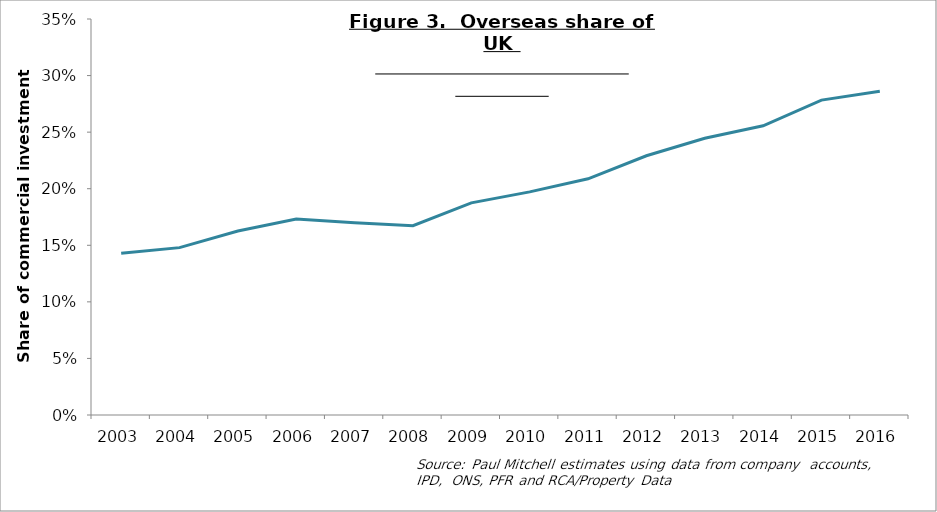
| Category | Series 0 |
|---|---|
| 2003.0 | 0.143 |
| 2004.0 | 0.148 |
| 2005.0 | 0.163 |
| 2006.0 | 0.173 |
| 2007.0 | 0.17 |
| 2008.0 | 0.167 |
| 2009.0 | 0.187 |
| 2010.0 | 0.197 |
| 2011.0 | 0.209 |
| 2012.0 | 0.229 |
| 2013.0 | 0.245 |
| 2014.0 | 0.256 |
| 2015.0 | 0.278 |
| 2016.0 | 0.286 |